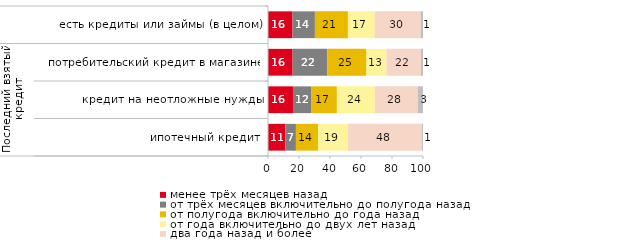
| Category | менее трёх месяцев назад | от трёх месяцев включительно до полугода назад | от полугода включительно до года назад | от года включительно до двух лет назад | два года назад и более | затрудняюсь ответить |
|---|---|---|---|---|---|---|
| 0 | 15.816 | 14.446 | 21.295 | 17.31 | 29.639 | 1.494 |
| 1 | 15.88 | 22.318 | 25.322 | 12.876 | 22.318 | 1.288 |
| 2 | 16.111 | 11.667 | 16.667 | 24.444 | 27.778 | 3.333 |
| 3 | 11.18 | 6.832 | 14.286 | 19.255 | 47.826 | 0.621 |